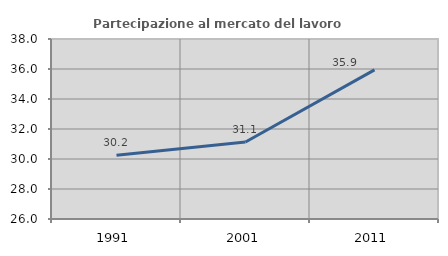
| Category | Partecipazione al mercato del lavoro  femminile |
|---|---|
| 1991.0 | 30.244 |
| 2001.0 | 31.135 |
| 2011.0 | 35.943 |